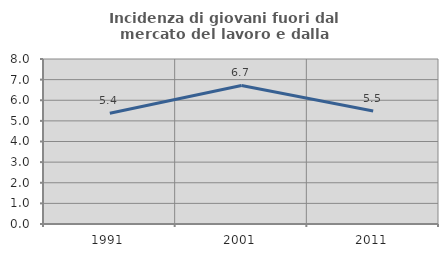
| Category | Incidenza di giovani fuori dal mercato del lavoro e dalla formazione  |
|---|---|
| 1991.0 | 5.368 |
| 2001.0 | 6.716 |
| 2011.0 | 5.479 |